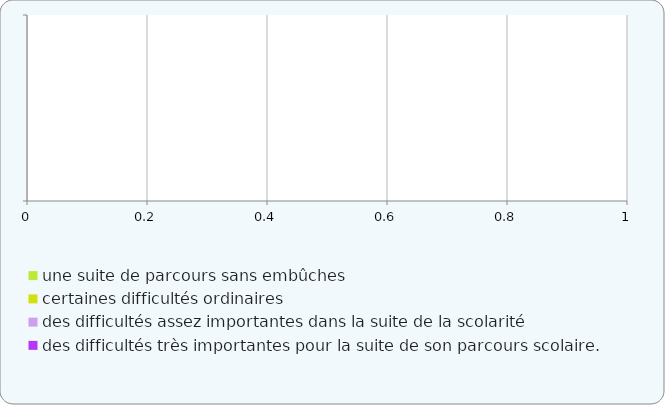
| Category | une suite de parcours sans embûches | certaines difficultés ordinaires  | des difficultés assez importantes dans la suite de la scolarité | des difficultés très importantes pour la suite de son parcours scolaire. |
|---|---|---|---|---|
|  | 0 | 0 | 0 | 0 |